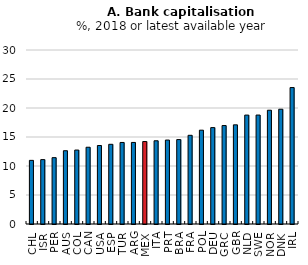
| Category | Series 0 |
|---|---|
| CHL | 10.971 |
| ISR | 11.1 |
| PER | 11.438 |
| AUS | 12.634 |
| COL | 12.748 |
| CAN | 13.235 |
| USA | 13.533 |
| ESP | 13.74 |
| TUR | 14.058 |
| ARG | 14.06 |
| MEX | 14.218 |
| ITA | 14.348 |
| PRT | 14.472 |
| BRA | 14.558 |
| FRA | 15.293 |
| POL | 16.176 |
| DEU | 16.62 |
| GRC | 16.973 |
| GBR | 17.097 |
| NLD | 18.777 |
| SWE | 18.785 |
| NOR | 19.616 |
| DNK | 19.788 |
| IRL | 23.525 |